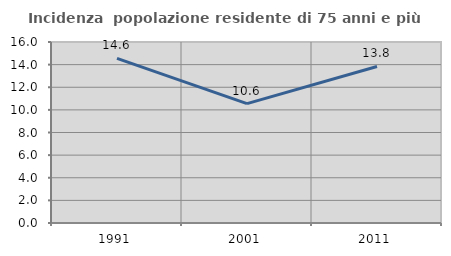
| Category | Incidenza  popolazione residente di 75 anni e più |
|---|---|
| 1991.0 | 14.55 |
| 2001.0 | 10.554 |
| 2011.0 | 13.838 |